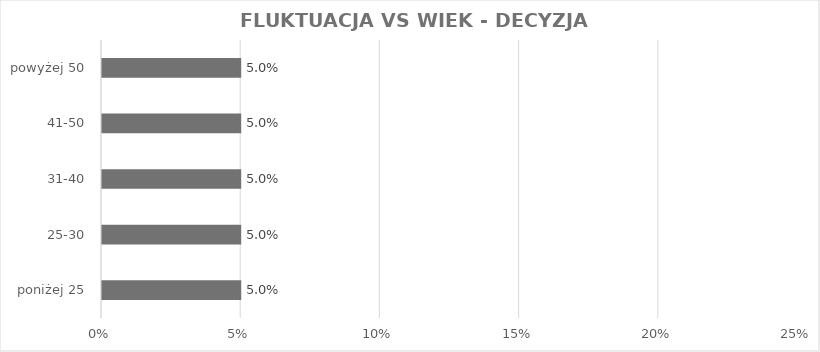
| Category | Series 0 |
|---|---|
| poniżej 25 | 0.05 |
| 25-30 | 0.05 |
| 31-40 | 0.05 |
| 41-50 | 0.05 |
| powyżej 50 | 0.05 |